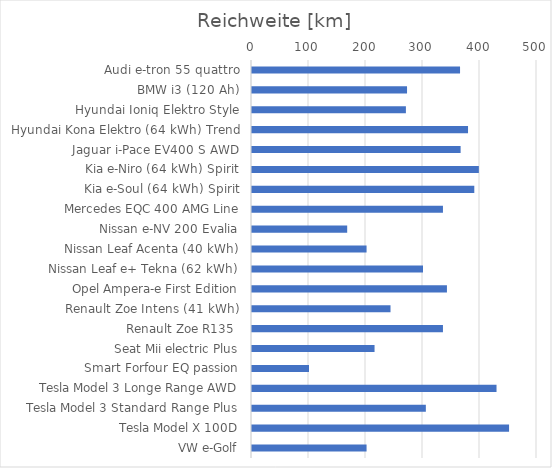
| Category | Series 0 |
|---|---|
| Audi e-tron 55 quattro | 365 |
| BMW i3 (120 Ah) | 272 |
| Hyundai Ioniq Elektro Style | 270 |
| Hyundai Kona Elektro (64 kWh) Trend | 379 |
| Jaguar i-Pace EV400 S AWD | 366 |
| Kia e-Niro (64 kWh) Spirit | 398 |
| Kia e-Soul (64 kWh) Spirit | 390 |
| Mercedes EQC 400 AMG Line | 335 |
| Nissan e-NV 200 Evalia | 167 |
| Nissan Leaf Acenta (40 kWh) | 201 |
| Nissan Leaf e+ Tekna (62 kWh) | 300 |
| Opel Ampera-e First Edition | 342 |
| Renault Zoe Intens (41 kWh) | 243 |
| Renault Zoe R135  | 335 |
| Seat Mii electric Plus | 215 |
| Smart Forfour EQ passion | 100 |
| Tesla Model 3 Longe Range AWD | 429 |
| Tesla Model 3 Standard Range Plus | 305 |
| Tesla Model X 100D | 451 |
| VW e-Golf | 201 |